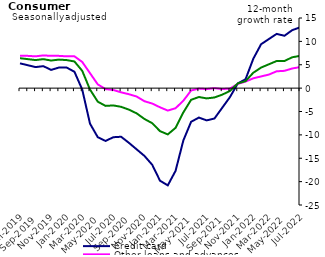
| Category | Credit card | Other loans and advances | Total |
|---|---|---|---|
| Jul-2019 | 5.3 | 6.9 | 6.4 |
| Aug-2019 | 4.9 | 6.9 | 6.2 |
| Sep-2019 | 4.5 | 6.8 | 6 |
| Oct-2019 | 4.7 | 7 | 6.2 |
| Nov-2019 | 3.9 | 6.9 | 5.9 |
| Dec-2019 | 4.4 | 6.9 | 6.1 |
| Jan-2020 | 4.4 | 6.8 | 6 |
| Feb-2020 | 3.5 | 6.8 | 5.7 |
| Mar-2020 | -0.3 | 5.6 | 3.7 |
| Apr-2020 | -7.6 | 3.2 | -0.3 |
| May-2020 | -10.5 | 0.8 | -2.9 |
| Jun-2020 | -11.3 | -0.2 | -3.8 |
| Jul-2020 | -10.5 | -0.4 | -3.7 |
| Aug-2020 | -10.4 | -0.9 | -4 |
| Sep-2020 | -11.7 | -1.3 | -4.6 |
| Oct-2020 | -13.1 | -1.8 | -5.4 |
| Nov-2020 | -14.5 | -2.8 | -6.6 |
| Dec-2020 | -16.4 | -3.3 | -7.5 |
| Jan-2021 | -19.8 | -4.1 | -9.2 |
| Feb-2021 | -20.8 | -4.8 | -9.9 |
| Mar-2021 | -17.7 | -4.3 | -8.5 |
| Apr-2021 | -11.2 | -2.7 | -5.2 |
| May-2021 | -7.2 | -0.5 | -2.5 |
| Jun-2021 | -6.3 | -0.1 | -1.9 |
| Jul-2021 | -6.9 | -0.2 | -2.2 |
| Aug-2021 | -6.5 | 0 | -2 |
| Sep-2021 | -4.2 | -0.2 | -1.4 |
| Oct-2021 | -1.9 | -0.1 | -0.6 |
| Nov-2021 | 1 | 0.9 | 1 |
| Dec-2021 | 1.9 | 1.4 | 1.5 |
| Jan-2022 | 6.3 | 2.1 | 3.3 |
| Feb-2022 | 9.4 | 2.5 | 4.4 |
| Mar-2022 | 10.5 | 2.9 | 5.1 |
| Apr-2022 | 11.6 | 3.6 | 5.8 |
| May-2022 | 11.2 | 3.7 | 5.8 |
| Jun-2022 | 12.4 | 4.2 | 6.6 |
| Jul-2022 | 13 | 4.5 | 6.9 |